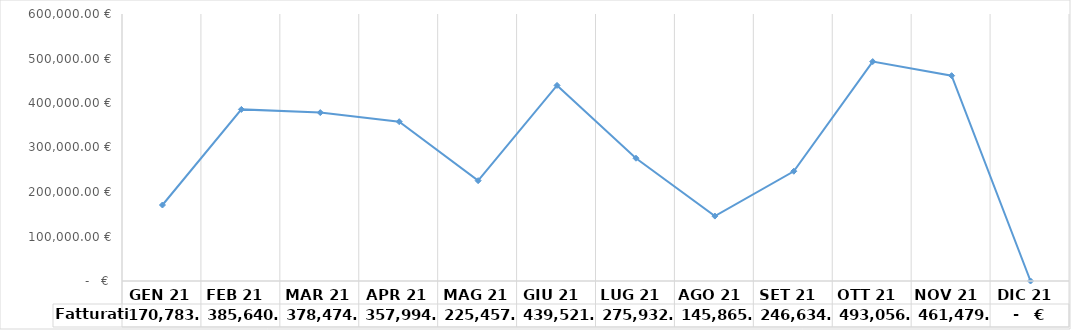
| Category | Fatturati |
|---|---|
|  GEN 21   | 170783.02 |
|  FEB 21   | 385640.264 |
|  MAR 21   | 378474.216 |
|  APR 21   | 357994.454 |
|  MAG 21   | 225457.434 |
| GIU 21  | 439521.303 |
| LUG 21  | 275932 |
| AGO 21  | 145865.371 |
| SET 21  | 246634.552 |
| OTT 21  | 493056.577 |
| NOV 21  | 461479.397 |
| DIC 21  | 0 |